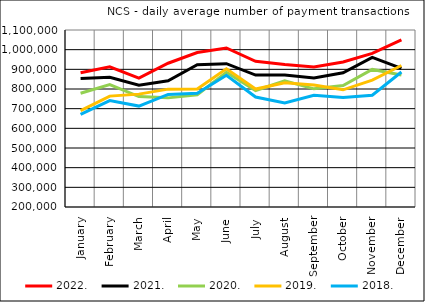
| Category | 2022. | 2021. | 2020. | 2019. | 2018. |
|---|---|---|---|---|---|
| January | 882511.45 | 853754.053 | 778386.81 | 689751.091 | 670809.409 |
| February | 912942.45 | 859628.3 | 822257.2 | 763826.65 | 741137.75 |
| March | 854937 | 818802.696 | 761733.545 | 773935 | 713060.591 |
| April | 930995.85 | 841884.19 | 754915.524 | 799356.238 | 772291.75 |
| May | 985566.143 | 923925.619 | 770679.5 | 799842.5 | 778037.762 |
| June | 1008762.1 | 928567.35 | 885057.1 | 902740.833 | 869634.895 |
| July | 940873.905 | 870946.727 | 792290.391 | 799875.957 | 759128.091 |
| August | 924251.524 | 870563.381 | 841869.45 | 831878.4 | 729390.5 |
| September | 911815.864 | 855873.955 | 800855.227 | 820234.619 | 767941.55 |
| October | 937400.095 | 882185.333 | 817634.955 | 795833.545 | 757187.045 |
| November | 980951.85 | 961075.6 | 899582.25 | 844880.2 | 768167.524 |
| December | 1050046.19 | 905247.522 | 870844.364 | 919506.8 | 886204.421 |